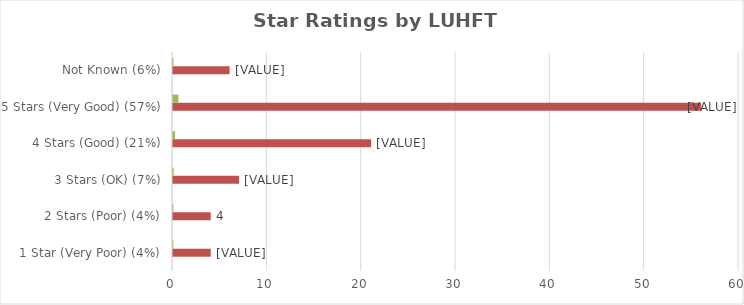
| Category | Series 0 | Series 1 | Series 2 |
|---|---|---|---|
| 1 Star (Very Poor) (4%) |  | 4 | 0.04 |
| 2 Stars (Poor) (4%) |  | 4 | 0.04 |
| 3 Stars (OK) (7%) |  | 7 | 0.07 |
| 4 Stars (Good) (21%) |  | 21 | 0.21 |
| 5 Stars (Very Good) (57%) |  | 56 | 0.57 |
| Not Known (6%) |  | 6 | 0.06 |